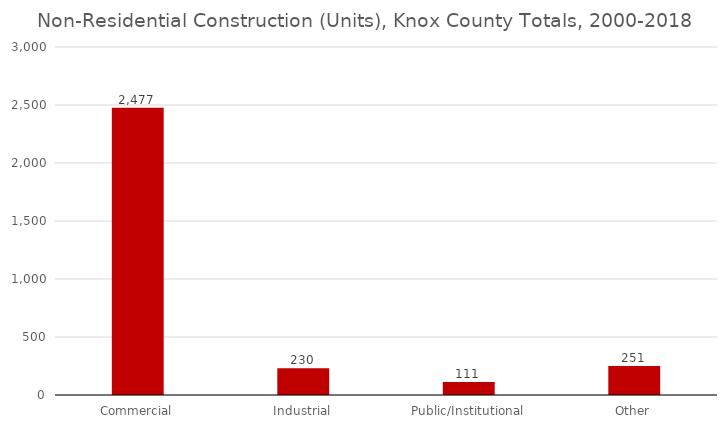
| Category | Non-Residential |
|---|---|
| Commercial | 2477 |
| Industrial | 230 |
| Public/Institutional | 111 |
| Other | 251 |